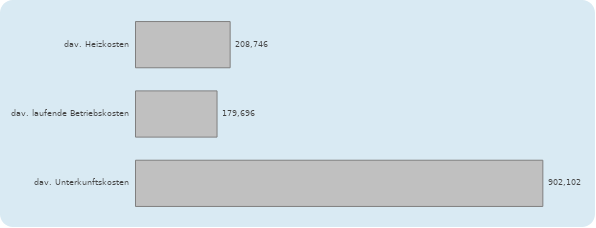
| Category | Wert |
|---|---|
| dav. Heizkosten | 208746 |
| dav. laufende Betriebskosten | 179696 |
| dav. Unterkunftskosten | 902102 |